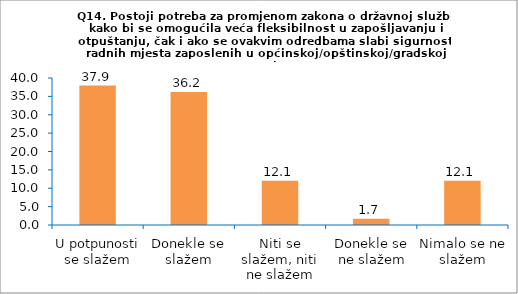
| Category | Series 0 |
|---|---|
| U potpunosti se slažem | 37.931 |
| Donekle se slažem | 36.207 |
| Niti se slažem, niti ne slažem | 12.069 |
| Donekle se ne slažem | 1.724 |
| Nimalo se ne slažem | 12.069 |